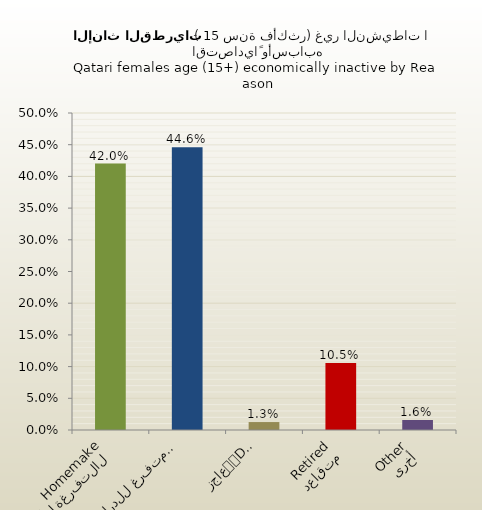
| Category | الاناث القطريات |
|---|---|
| التفرغة لأعمال المنزل
Homemaker | 0.42 |
| متفرغ للدراسة
Student | 0.446 |
| عاجز
Disabled | 0.013 |
| متقاعد
Retired | 0.105 |
| أخرى
Other | 0.016 |